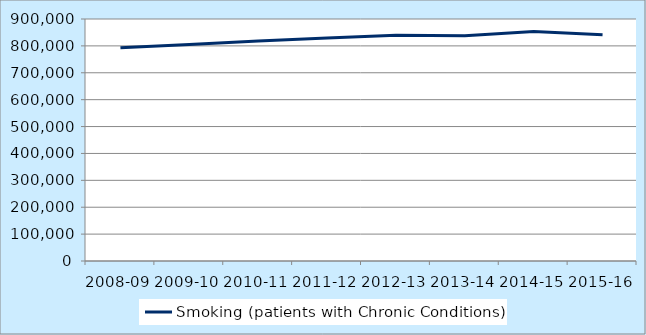
| Category | Smoking (patients with Chronic Conditions) |
|---|---|
| 2008-09 | 793154 |
| 2009-10 | 805502 |
| 2010-11 | 817891 |
| 2011-12 | 829532 |
| 2012-13 | 839213 |
| 2013-14 | 837729 |
| 2014-15 | 853552 |
| 2015-16 | 841227 |